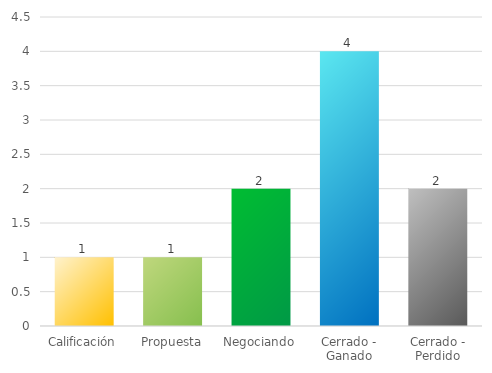
| Category | Series 0 |
|---|---|
| Calificación | 1 |
| Propuesta | 1 |
| Negociando | 2 |
| Cerrado - Ganado | 4 |
| Cerrado - Perdido | 2 |